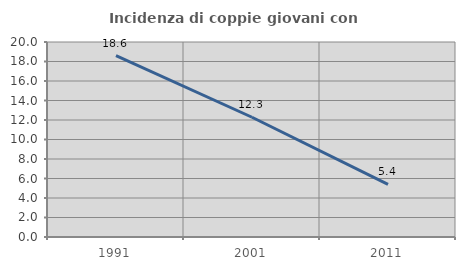
| Category | Incidenza di coppie giovani con figli |
|---|---|
| 1991.0 | 18.594 |
| 2001.0 | 12.283 |
| 2011.0 | 5.399 |